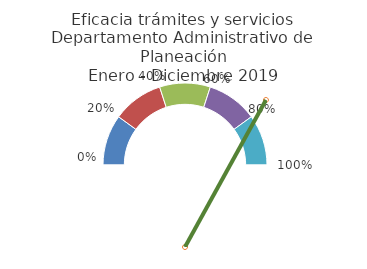
| Category | 2.979512548 |
|---|---|
| 0.0 | 0.2 |
| 0.2 | 0.2 |
| 0.4 | 0.2 |
| 0.6 | 0.2 |
| 0.8 | 0.2 |
| 1.0 | 1 |